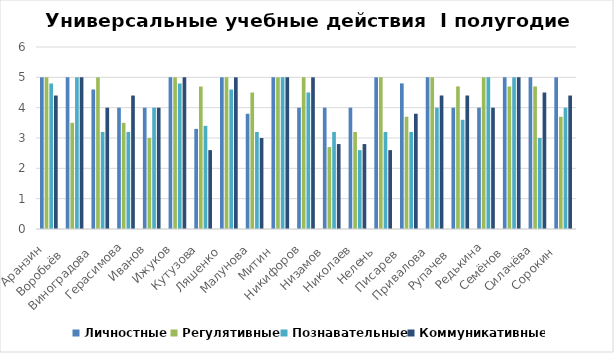
| Category | Личностные | Регулятивные | Познавательные | Коммуникативные |
|---|---|---|---|---|
| Аранзин  | 5 | 5 | 4.8 | 4.4 |
| Воробьёв    | 5 | 3.5 | 5 | 5 |
| Виноградова   | 4.6 | 5 | 3.2 | 4 |
| Герасимова | 4 | 3.5 | 3.2 | 4.4 |
| Иванов  | 4 | 3 | 4 | 4 |
| Ижуков  | 5 | 5 | 4.8 | 5 |
| Кутузова  | 3.3 | 4.7 | 3.4 | 2.6 |
| Ляшенко   | 5 | 5 | 4.6 | 5 |
| Малунова  | 3.8 | 4.5 | 3.2 | 3 |
| Митин   | 5 | 5 | 5 | 5 |
| Никифоров  | 4 | 5 | 4.5 | 5 |
| Низамов   | 4 | 2.7 | 3.2 | 2.8 |
| Николаев  | 4 | 3.2 | 2.6 | 2.8 |
| Нелень   | 5 | 5 | 3.2 | 2.6 |
| Писарев    | 4.8 | 3.7 | 3.2 | 3.8 |
| Привалова   | 5 | 5 | 4 | 4.4 |
| Рупачев    | 4 | 4.7 | 3.6 | 4.4 |
| Редькина | 4 | 5 | 5 | 4 |
| Семёнов   | 5 | 4.7 | 5 | 5 |
| Силачёва  | 5 | 4.7 | 3 | 4.5 |
| Сорокин   | 5 | 3.7 | 4 | 4.4 |